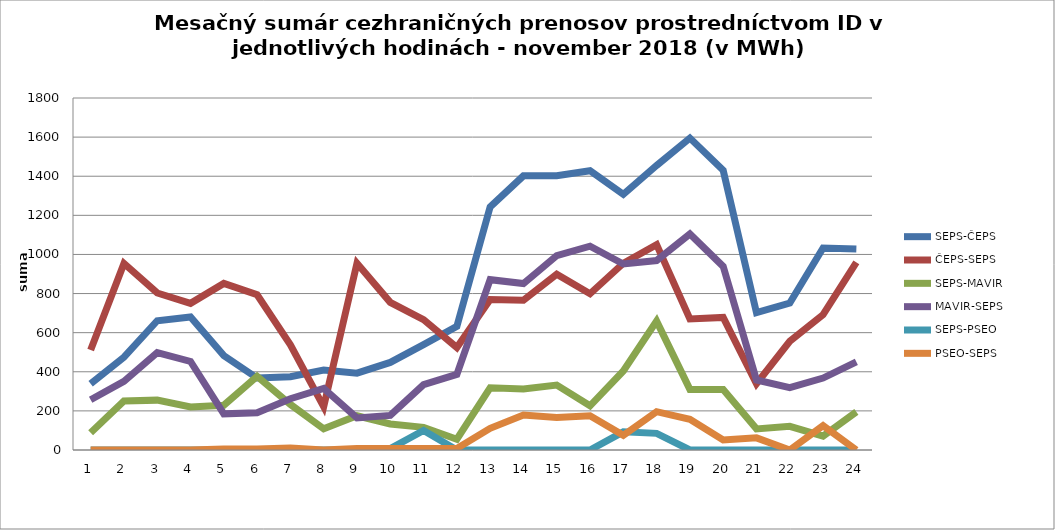
| Category | SEPS-ČEPS | ČEPS-SEPS | SEPS-MAVIR | MAVIR-SEPS | SEPS-PSEO | PSEO-SEPS |
|---|---|---|---|---|---|---|
| 1.0 | 339 | 511 | 88 | 257 | 0 | 0 |
| 2.0 | 475 | 954 | 251 | 351 | 0 | 0 |
| 3.0 | 661 | 803 | 255 | 498 | 0 | 0 |
| 4.0 | 680 | 750 | 220 | 453 | 0 | 0 |
| 5.0 | 483 | 852 | 229 | 185 | 0 | 5 |
| 6.0 | 368 | 794 | 377 | 190 | 0 | 5 |
| 7.0 | 375 | 538 | 233 | 262 | 0 | 10 |
| 8.0 | 409 | 221 | 108 | 315 | 0 | 0 |
| 9.0 | 393 | 955 | 175 | 164 | 0 | 8 |
| 10.0 | 448 | 755 | 133 | 177 | 7 | 8 |
| 11.0 | 539 | 667 | 116 | 334 | 100 | 8 |
| 12.0 | 632 | 524 | 55 | 387 | 0 | 8 |
| 13.0 | 1243 | 769 | 318 | 871 | 0 | 111 |
| 14.0 | 1402 | 766 | 312 | 851 | 0 | 179 |
| 15.0 | 1403 | 899 | 332 | 994 | 0 | 166 |
| 16.0 | 1428 | 799 | 226 | 1042 | 0 | 175 |
| 17.0 | 1307 | 955 | 404 | 951 | 93 | 75 |
| 18.0 | 1455 | 1050 | 659 | 969 | 85 | 196 |
| 19.0 | 1595 | 670 | 310 | 1105 | 0 | 157 |
| 20.0 | 1430 | 678 | 310 | 939 | 0 | 51 |
| 21.0 | 702 | 339 | 108 | 358 | 0 | 62 |
| 22.0 | 751 | 556 | 121 | 319 | 0 | 0 |
| 23.0 | 1033 | 692 | 71 | 368 | 0 | 125 |
| 24.0 | 1028 | 959 | 195 | 451 | 0 | 0 |